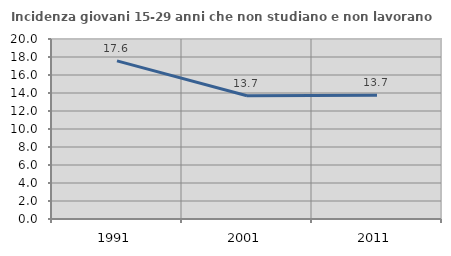
| Category | Incidenza giovani 15-29 anni che non studiano e non lavorano  |
|---|---|
| 1991.0 | 17.575 |
| 2001.0 | 13.697 |
| 2011.0 | 13.749 |